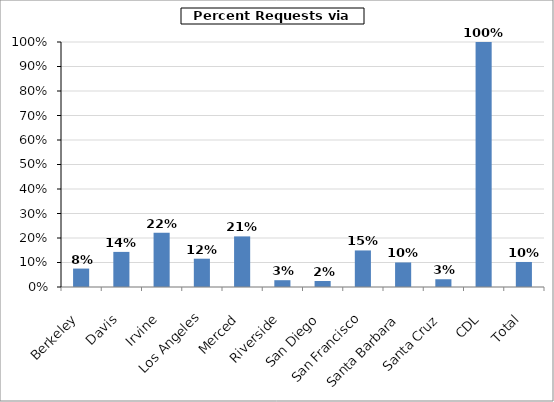
| Category | Series 0 |
|---|---|
| Berkeley | 0.075 |
| Davis | 0.143 |
| Irvine | 0.221 |
| Los Angeles | 0.115 |
| Merced | 0.207 |
| Riverside | 0.028 |
| San Diego | 0.025 |
| San Francisco | 0.149 |
| Santa Barbara | 0.1 |
| Santa Cruz | 0.032 |
| CDL | 1 |
| Total | 0.102 |